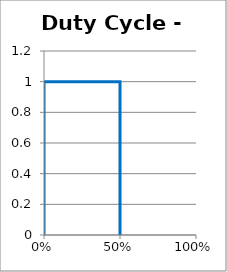
| Category | Blue |
|---|---|
| 0.0 | 0 |
| 0.0 | 1 |
| 0.5 | 1 |
| 0.5 | 0 |